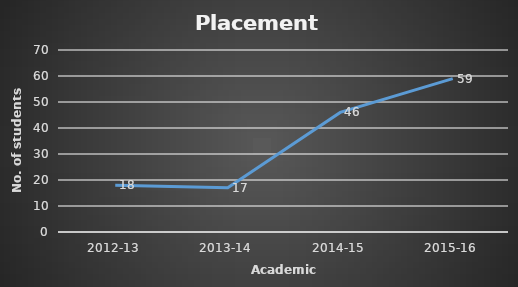
| Category | Students |
|---|---|
| 2012-13 | 18 |
| 2013-14 | 17 |
| 2014-15 | 46 |
| 2015-16 | 59 |